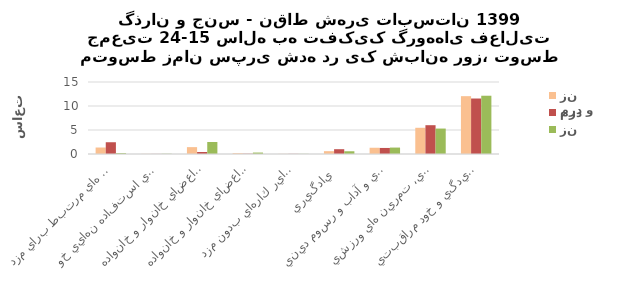
| Category | مرد و زن | مرد | زن |
|---|---|---|---|
| اشتغال و فعاليت هاي مرتبط براي مزد  | 1.35 | 2.45 | 0.18 |
| توليد كالا براي استفاده نهايي خود   | 0.03 | 0.02 | 0.05 |
| خدمات خانگي بدون مزد براي اعضاي خانوار و خانواده   | 1.43 | 0.42 | 2.5 |
| خدمات مراقبتي بدون مزد براي اعضاي خانوار و خانواده   | 0.17 | 0.06 | 0.3 |
| كارداوطلبانه بدون مزد، كار آموزي و ساير كارهاي بدون مزد  | 0.03 | 0.03 | 0.03 |
| يادگيري  | 0.59 | 1 | 0.57 |
| معاشرت، ارتباط، مشاركت اجتماعي و آداب و رسوم ديني  | 1.3 | 1.26 | 1.34 |
| فرهنگ، فراغت، رسانه هاي گروهي، تمرين هاي ورزشي  | 5.46 | 6 | 5.3 |
| رسيدگي و خود مراقبتي   | 12.05 | 11.56 | 12.14 |